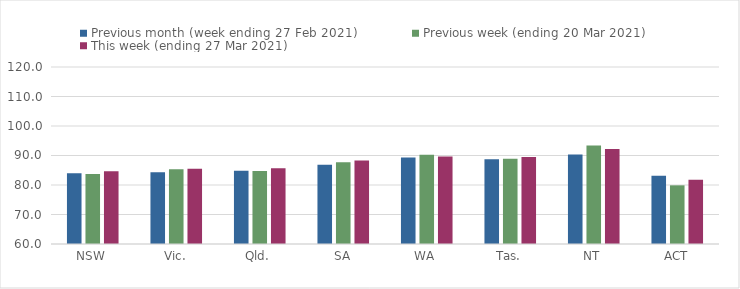
| Category | Previous month (week ending 27 Feb 2021) | Previous week (ending 20 Mar 2021) | This week (ending 27 Mar 2021) |
|---|---|---|---|
| NSW | 84.01 | 83.74 | 84.62 |
| Vic. | 84.33 | 85.37 | 85.51 |
| Qld. | 84.81 | 84.78 | 85.64 |
| SA | 86.84 | 87.74 | 88.3 |
| WA | 89.33 | 90.23 | 89.7 |
| Tas. | 88.76 | 88.91 | 89.53 |
| NT | 90.36 | 93.36 | 92.22 |
| ACT | 83.13 | 79.89 | 81.75 |